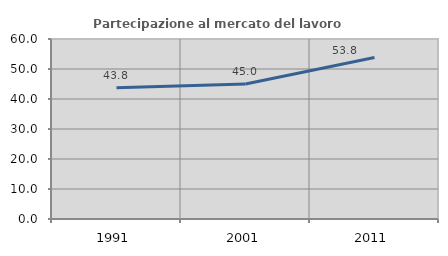
| Category | Partecipazione al mercato del lavoro  femminile |
|---|---|
| 1991.0 | 43.784 |
| 2001.0 | 44.981 |
| 2011.0 | 53.804 |